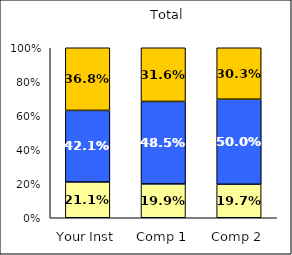
| Category | Low Career Related Stress | Average Career Related Stress | High Career Related Stress |
|---|---|---|---|
| Your Inst | 0.211 | 0.421 | 0.368 |
| Comp 1 | 0.199 | 0.485 | 0.316 |
| Comp 2 | 0.197 | 0.5 | 0.303 |